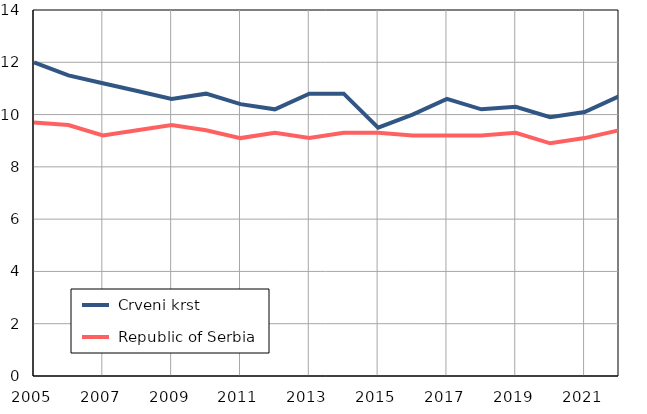
| Category |  Crveni krst |  Republic of Serbia |
|---|---|---|
| 2005.0 | 12 | 9.7 |
| 2006.0 | 11.5 | 9.6 |
| 2007.0 | 11.2 | 9.2 |
| 2008.0 | 10.9 | 9.4 |
| 2009.0 | 10.6 | 9.6 |
| 2010.0 | 10.8 | 9.4 |
| 2011.0 | 10.4 | 9.1 |
| 2012.0 | 10.2 | 9.3 |
| 2013.0 | 10.8 | 9.1 |
| 2014.0 | 10.8 | 9.3 |
| 2015.0 | 9.5 | 9.3 |
| 2016.0 | 10 | 9.2 |
| 2017.0 | 10.6 | 9.2 |
| 2018.0 | 10.2 | 9.2 |
| 2019.0 | 10.3 | 9.3 |
| 2020.0 | 9.9 | 8.9 |
| 2021.0 | 10.1 | 9.1 |
| 2022.0 | 10.7 | 9.4 |